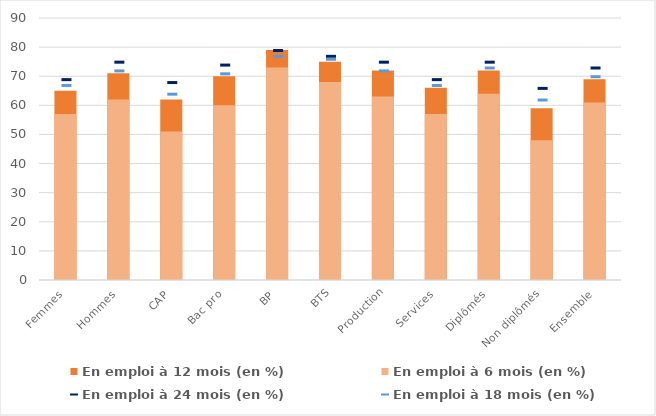
| Category | En emploi à 12 mois (en %) | En emploi à 6 mois (en %) |
|---|---|---|
| Femmes | 65 | 57 |
| Hommes | 71 | 62 |
| CAP | 62 | 51 |
| Bac pro | 70 | 60 |
| BP | 79 | 73 |
| BTS | 75 | 68 |
| Production | 72 | 63 |
| Services | 66 | 57 |
| Diplômés | 72 | 64 |
| Non diplômés | 59 | 48 |
| Ensemble | 69 | 61 |